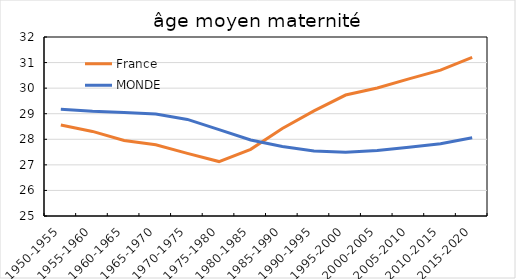
| Category | France | MONDE |
|---|---|---|
| 1950-1955 | 28.557 | 29.177 |
| 1955-1960 | 28.308 | 29.094 |
| 1960-1965 | 27.95 | 29.044 |
| 1965-1970 | 27.785 | 28.986 |
| 1970-1975 | 27.449 | 28.776 |
| 1975-1980 | 27.128 | 28.377 |
| 1980-1985 | 27.607 | 27.97 |
| 1985-1990 | 28.424 | 27.719 |
| 1990-1995 | 29.111 | 27.546 |
| 1995-2000 | 29.73 | 27.496 |
| 2000-2005 | 30.009 | 27.565 |
| 2005-2010 | 30.363 | 27.685 |
| 2010-2015 | 30.705 | 27.822 |
| 2015-2020 | 31.199 | 28.059 |